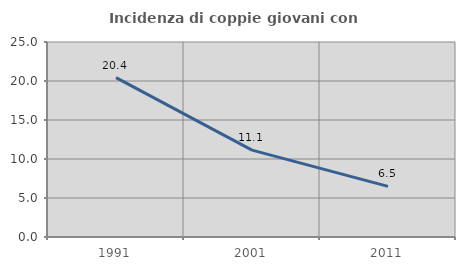
| Category | Incidenza di coppie giovani con figli |
|---|---|
| 1991.0 | 20.428 |
| 2001.0 | 11.132 |
| 2011.0 | 6.488 |